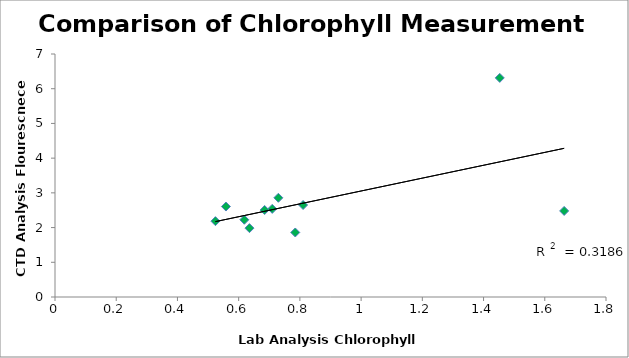
| Category | Series 0 |
|---|---|
| 1.6633212065343477 | 2.48 |
| 1.4529058735287999 | 6.312 |
| 0.7296531699660052 | 2.858 |
| 0.6184450662102214 | 2.225 |
| 0.5240381867628656 | 2.185 |
| 0.7848571926936965 | 1.858 |
| 0.8104590583065385 | 2.65 |
| 0.5584406936801224 | 2.606 |
| 0.6352462905186493 | 1.984 |
| 0.6848499051435313 | 2.507 |
| 0.7096517124559723 | 2.539 |